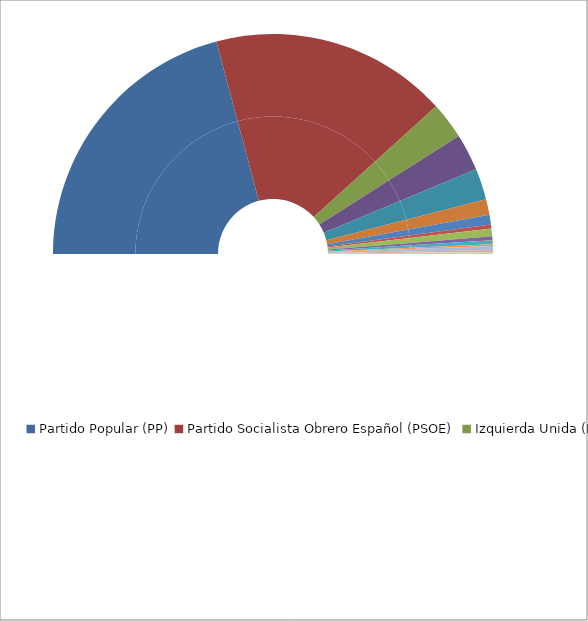
| Category | Series 0 | Series 1 |
|---|---|---|
| Partido Popular (PP) | 146 | 41.714 |
| Partido Socialista Obrero Español (PSOE) | 122 | 34.857 |
| Izquierda Unida (IU) | 19 | 5.429 |
| Partit dels Socialistes de Catalunya (PSC-PSOE) | 19 | 5.429 |
| Convergencia i Unió (CIU) | 16 | 4.571 |
| Partido Popular - Partido Aragonés (PP-PAR) | 8 | 2.286 |
| Eusko Alderdi Jetzalea-Partido Nacionalista Vasco (EAJ-PNV) | 5 | 1.429 |
| Iniciativa per Catalunya - Els Verds (IC-EV) | 2 | 0.571 |
| Coalición Canaria (CC) | 4 | 1.143 |
| Bloque Nacionalista Galego (BNG) | 2 | 0.571 |
| Herri Batasuna (HB) | 2 | 0.571 |
| Esquerra Republicana de Catalunya (ERC) | 1 | 0.286 |
| Unión del Pueblo Navarro - Partido Popular (UPN-PP) | 2 | 0.571 |
| Eusko Alkartasuna (EA) | 1 | 0.286 |
| Unió Valenciana (UV) | 1 | 0.286 |